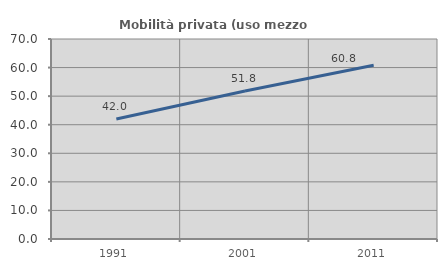
| Category | Mobilità privata (uso mezzo privato) |
|---|---|
| 1991.0 | 41.983 |
| 2001.0 | 51.826 |
| 2011.0 | 60.799 |